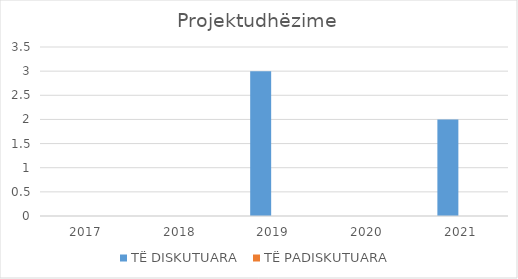
| Category | TË DISKUTUARA  | TË PADISKUTUARA  |
|---|---|---|
| 2017.0 | 0 | 0 |
| 2018.0 | 0 | 0 |
| 2019.0 | 3 | 0 |
| 2020.0 | 0 | 0 |
| 2021.0 | 2 | 0 |